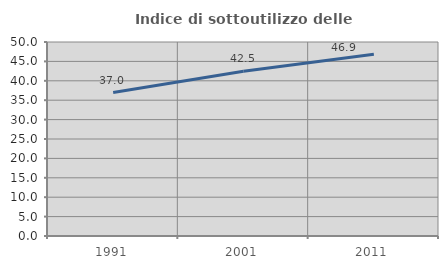
| Category | Indice di sottoutilizzo delle abitazioni  |
|---|---|
| 1991.0 | 36.984 |
| 2001.0 | 42.461 |
| 2011.0 | 46.86 |